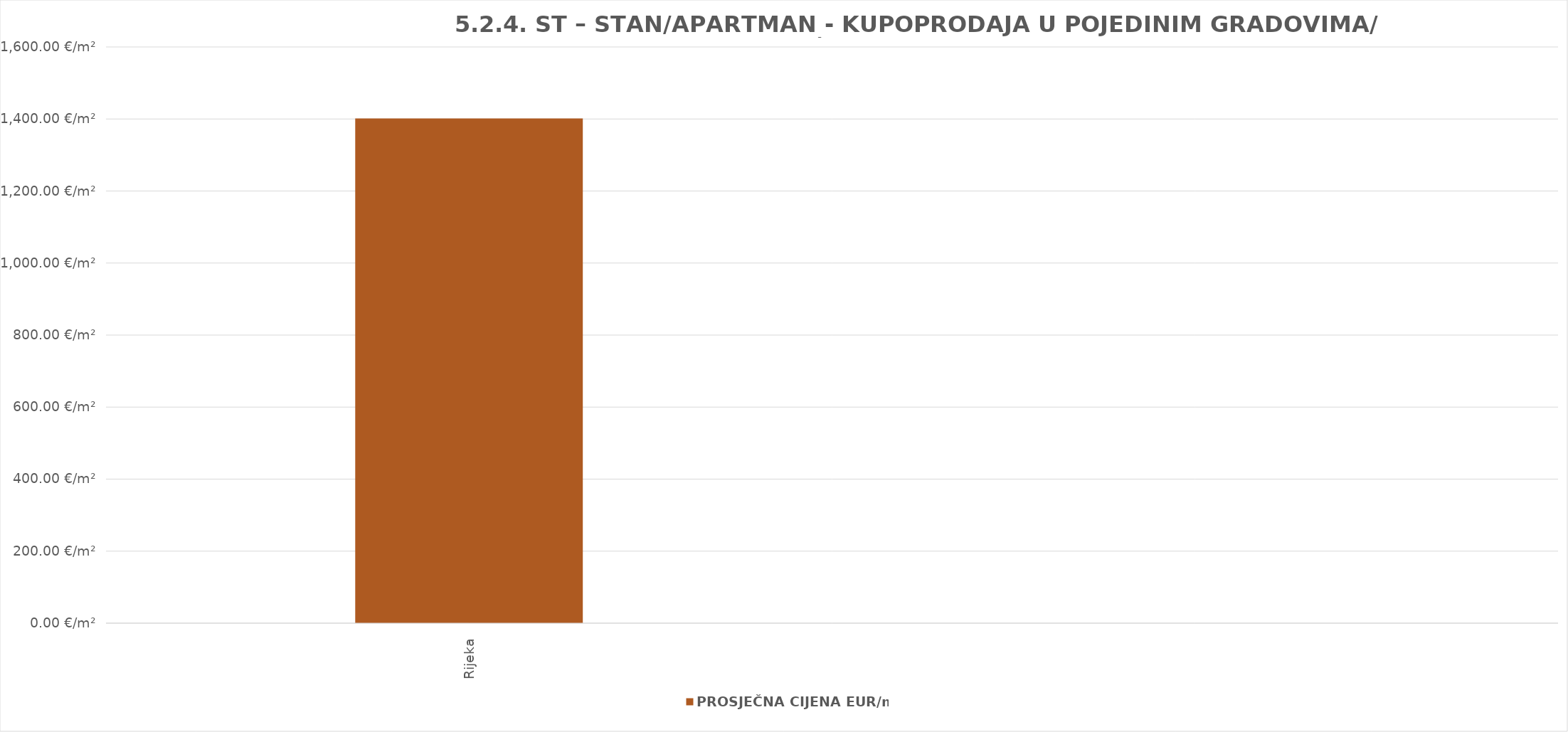
| Category | PROSJEČNA CIJENA EUR/m² |
|---|---|
| Rijeka | 1903-11-01 11:11:38 |